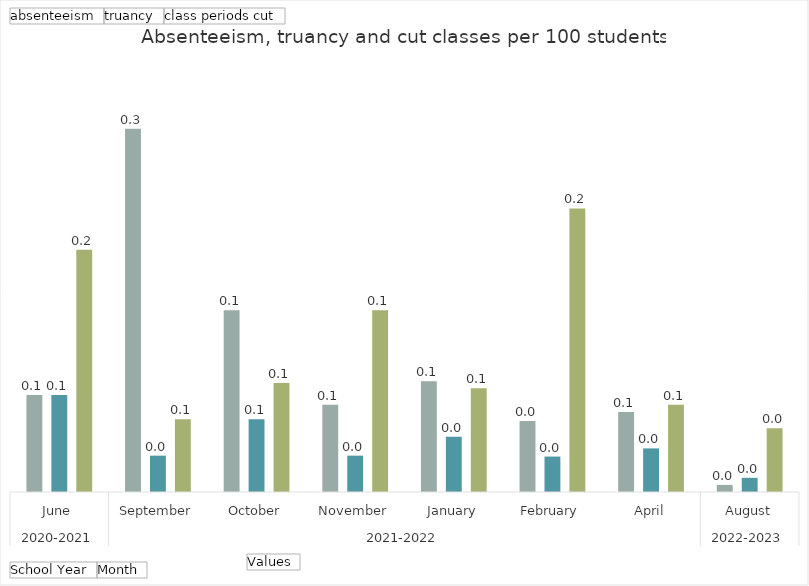
| Category | absenteeism | truancy | class periods cut |
|---|---|---|---|
| 0 | 0.067 | 0.067 | 0.167 |
| 1 | 0.25 | 0.025 | 0.05 |
| 2 | 0.125 | 0.05 | 0.075 |
| 3 | 0.06 | 0.025 | 0.125 |
| 4 | 0.076 | 0.038 | 0.071 |
| 5 | 0.049 | 0.024 | 0.195 |
| 6 | 0.055 | 0.03 | 0.06 |
| 7 | 0.005 | 0.01 | 0.044 |